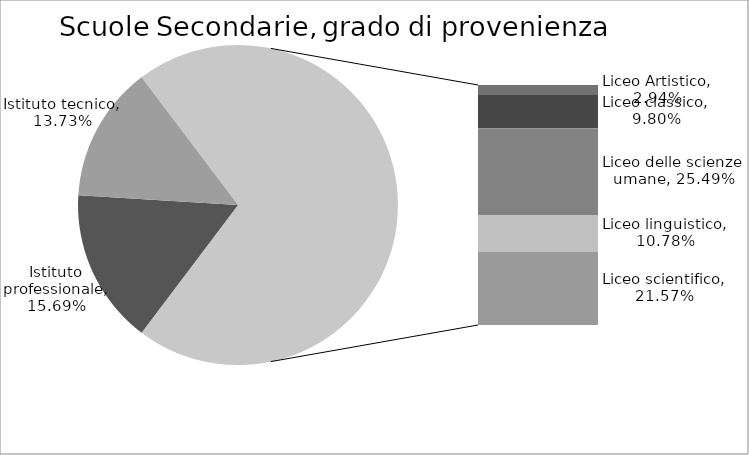
| Category | Totale |
|---|---|
| Istituto professionale | 0.157 |
| Istituto tecnico | 0.137 |
| Liceo Artistico | 0.029 |
| Liceo classico | 0.098 |
| Liceo delle scienze umane | 0.255 |
| Liceo linguistico | 0.108 |
| Liceo scientifico | 0.216 |